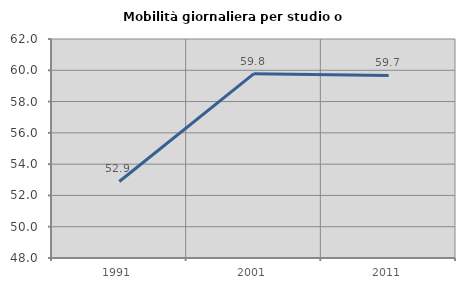
| Category | Mobilità giornaliera per studio o lavoro |
|---|---|
| 1991.0 | 52.891 |
| 2001.0 | 59.784 |
| 2011.0 | 59.67 |